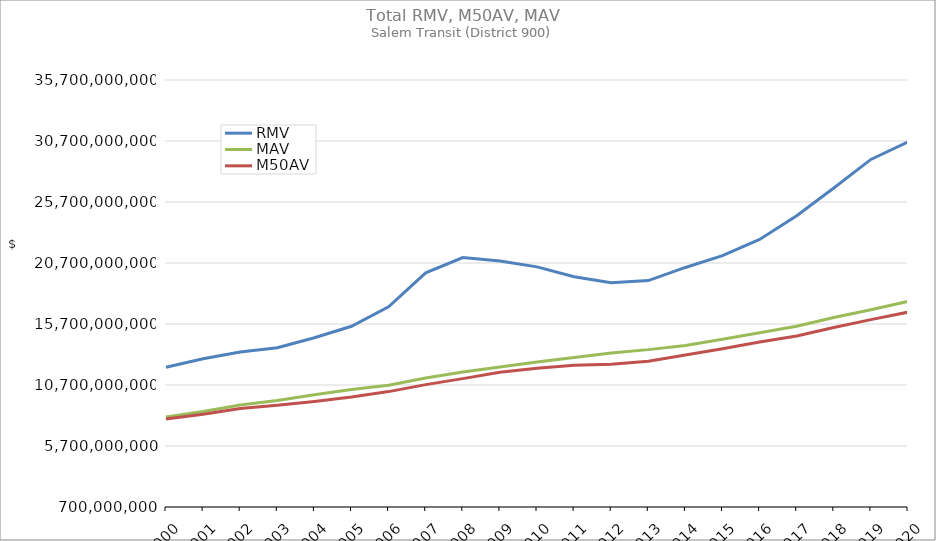
| Category | RMV | MAV | M50AV |
|---|---|---|---|
| 2000.0 | 12161341794 | 8069910348 | 7908841209 |
| 2001.0 | 12844248455 | 8519692632 | 8298421890 |
| 2002.0 | 13408837740 | 9053127277 | 8771899960 |
| 2003.0 | 13755028366 | 9428278383 | 9048227274 |
| 2004.0 | 14576639937 | 9896726992 | 9346201133 |
| 2005.0 | 15510951075 | 10339827944 | 9710513070 |
| 2006.0 | 17106242177 | 10677463393 | 10158621616 |
| 2007.0 | 19897184517 | 11271759964 | 10731845902 |
| 2008.0 | 21150311256 | 11772883723 | 11221117734 |
| 2009.0 | 20856851365 | 12174133848 | 11741312795 |
| 2010.0 | 20384551526 | 12588237084 | 12066033662 |
| 2011.0 | 19578327752 | 12946599400 | 12319485640 |
| 2012.0 | 19076297331 | 13329715031 | 12407021725 |
| 2013.0 | 19256012436 | 13599659216 | 12639977327 |
| 2014.0 | 20334625640 | 13942207493 | 13159486504 |
| 2015.0 | 21305162148 | 14453518866 | 13673235181 |
| 2016.0 | 22628139499 | 14990180880 | 14224554314 |
| 2017.0 | 24575900984 | 15518124778 | 14724182215 |
| 2018.0 | 26846476885 | 16233336425 | 15411214056 |
| 2019.0 | 29190046643 | 16864864071 | 16056245750 |
| 2020.0 | 30620051667 | 17554752796 | 16667937687 |